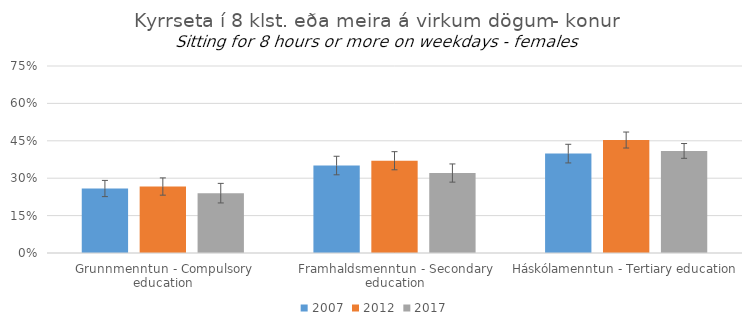
| Category | 2007 | 2012 | 2017 |
|---|---|---|---|
| Grunnmenntun - Compulsory education | 0.259 | 0.267 | 0.24 |
| Framhaldsmenntun - Secondary education | 0.351 | 0.37 | 0.321 |
| Háskólamenntun - Tertiary education | 0.399 | 0.453 | 0.409 |